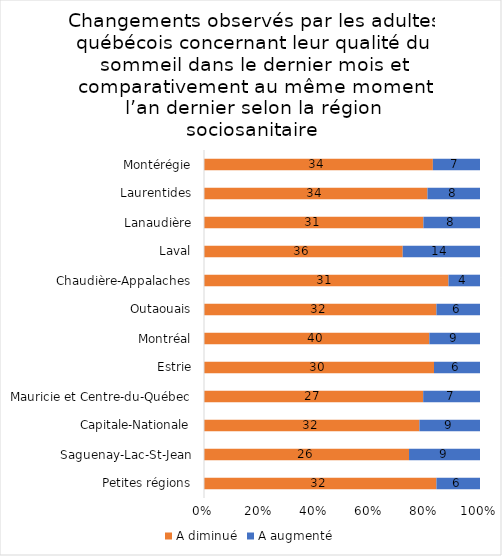
| Category | A diminué | A augmenté |
|---|---|---|
| Petites régions | 32 | 6 |
| Saguenay-Lac-St-Jean | 26 | 9 |
| Capitale-Nationale | 32 | 9 |
| Mauricie et Centre-du-Québec | 27 | 7 |
| Estrie | 30 | 6 |
| Montréal | 40 | 9 |
| Outaouais | 32 | 6 |
| Chaudière-Appalaches | 31 | 4 |
| Laval | 36 | 14 |
| Lanaudière | 31 | 8 |
| Laurentides | 34 | 8 |
| Montérégie | 34 | 7 |